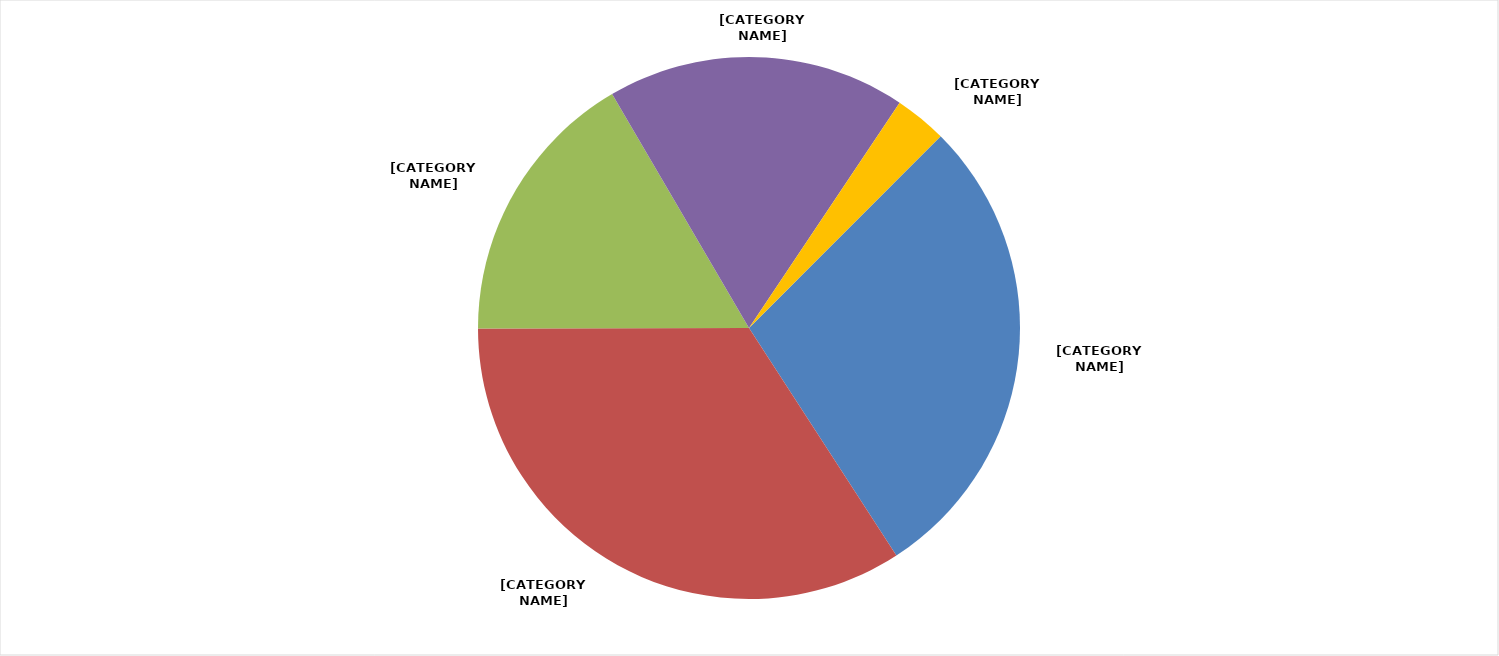
| Category | Series 0 |
|---|---|
| Local Government Contributions | 0.283 |
| Licenses, Permits & Fees | 0.341 |
| Revenue from State | 0.166 |
| Revenue from Federal | 0.178 |
| Misc/Fund Balance/Other | 0.031 |